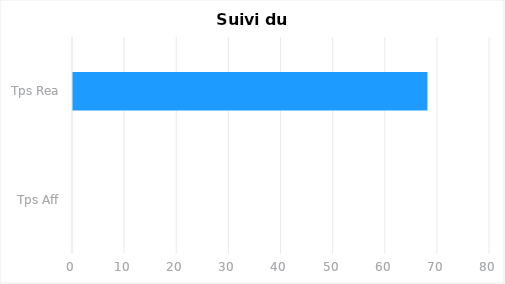
| Category | Series 0 |
|---|---|
| Tps Aff | 0 |
| Tps Rea | 68 |